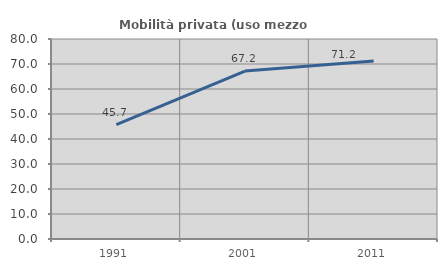
| Category | Mobilità privata (uso mezzo privato) |
|---|---|
| 1991.0 | 45.732 |
| 2001.0 | 67.172 |
| 2011.0 | 71.169 |